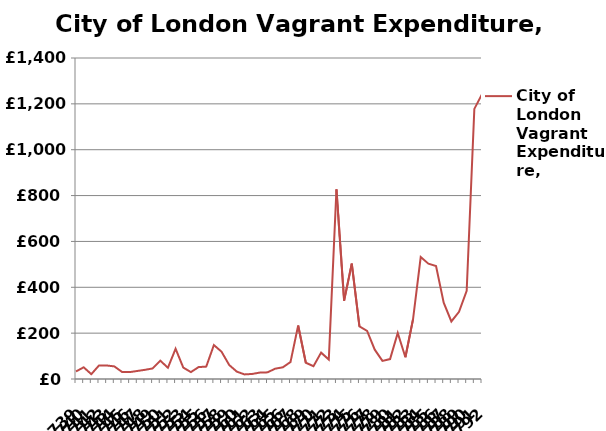
| Category | City of London Vagrant Expenditure, 1739-1792 |
|---|---|
| 1739 | 33 |
| 1740 | 51 |
| 1741 | 21 |
| 1742 | 59 |
| 1743 | 59 |
| 1744 | 55 |
| 1745 | 31 |
| 1746 | 30 |
| 1747 | 35 |
| 1748 | 40 |
| 1749 | 46 |
| 1750 | 80 |
| 1751 | 49 |
| 1752 | 132 |
| 1753 | 50 |
| 1754 | 30 |
| 1755 | 52 |
| 1756 | 54 |
| 1757 | 148 |
| 1758 | 119 |
| 1759 | 61 |
| 1760 | 32 |
| 1761 | 20 |
| 1762 | 22 |
| 1763 | 28 |
| 1764 | 29 |
| 1765 | 45 |
| 1766 | 51 |
| 1767 | 74 |
| 1768 | 233 |
| 1769 | 71 |
| 1770 | 56 |
| 1771 | 115 |
| 1772 | 85 |
| 1773 | 827 |
| 1774 | 342 |
| 1775 | 503 |
| 1776 | 229 |
| 1777 | 210 |
| 1778 | 128 |
| 1779 | 79 |
| 1780 | 87 |
| 1781 | 201 |
| 1782 | 95 |
| 1783 | 261 |
| 1784 | 532 |
| 1785 | 503 |
| 1786 | 493 |
| 1787 | 333 |
| 1788 | 251 |
| 1789 | 293 |
| 1790 | 385 |
| 1791 | 1178 |
| 1792 | 1242 |